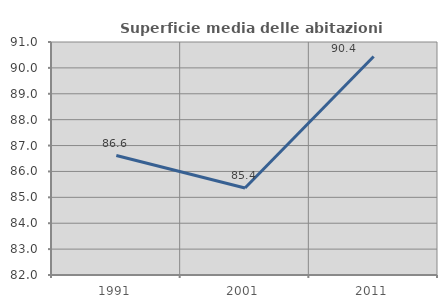
| Category | Superficie media delle abitazioni occupate |
|---|---|
| 1991.0 | 86.614 |
| 2001.0 | 85.363 |
| 2011.0 | 90.44 |